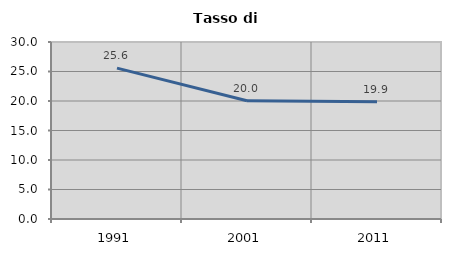
| Category | Tasso di disoccupazione   |
|---|---|
| 1991.0 | 25.578 |
| 2001.0 | 20.047 |
| 2011.0 | 19.868 |